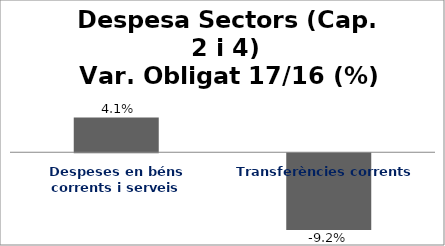
| Category | Series 0 |
|---|---|
| Despeses en béns corrents i serveis | 0.041 |
| Transferències corrents | -0.092 |